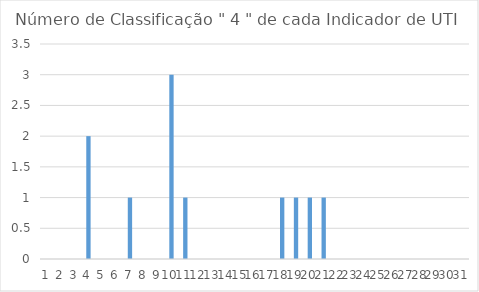
| Category | Series 0 |
|---|---|
| 0 | 0 |
| 1 | 0 |
| 2 | 0 |
| 3 | 2 |
| 4 | 0 |
| 5 | 0 |
| 6 | 1 |
| 7 | 0 |
| 8 | 0 |
| 9 | 3 |
| 10 | 1 |
| 11 | 0 |
| 12 | 0 |
| 13 | 0 |
| 14 | 0 |
| 15 | 0 |
| 16 | 0 |
| 17 | 1 |
| 18 | 1 |
| 19 | 1 |
| 20 | 1 |
| 21 | 0 |
| 22 | 0 |
| 23 | 0 |
| 24 | 0 |
| 25 | 0 |
| 26 | 0 |
| 27 | 0 |
| 28 | 0 |
| 29 | 0 |
| 30 | 0 |